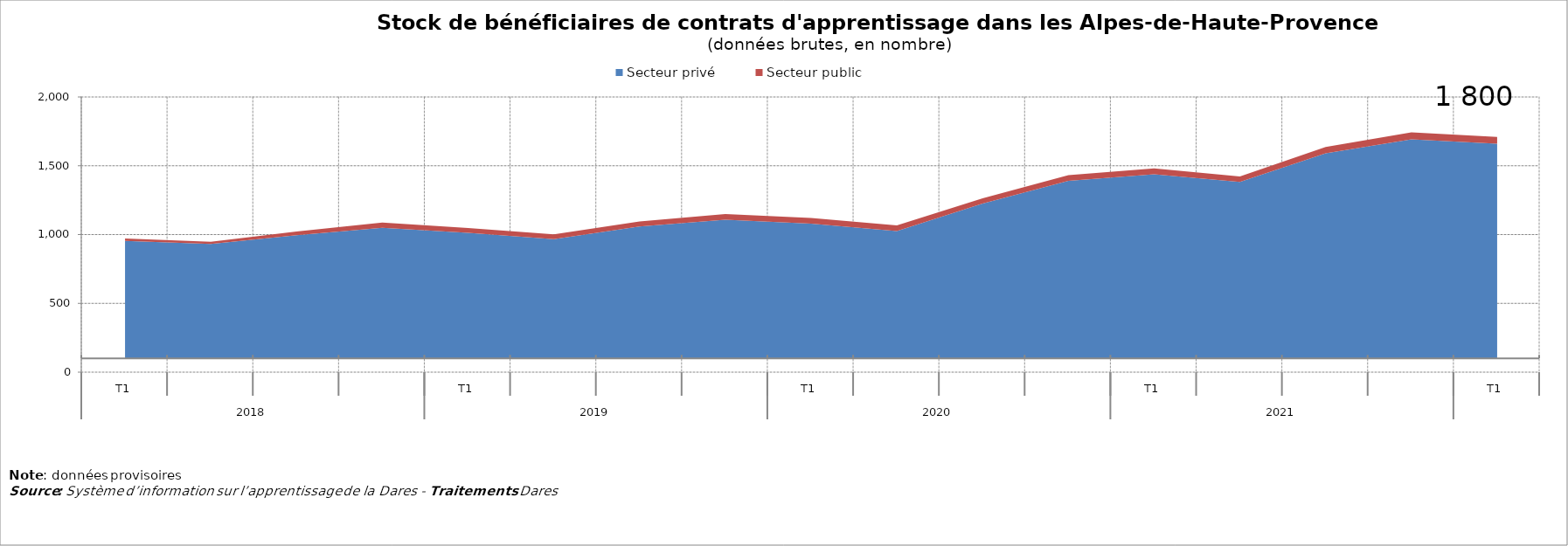
| Category | Secteur privé | Secteur public |
|---|---|---|
| 0 | 954 | 18 |
| 1 | 931 | 17 |
| 2 | 995 | 27 |
| 3 | 1050 | 37 |
| 4 | 1012 | 36 |
| 5 | 966 | 36 |
| 6 | 1058 | 38 |
| 7 | 1108 | 41 |
| 8 | 1080 | 40 |
| 9 | 1026 | 40 |
| 10 | 1225 | 38 |
| 11 | 1390 | 41 |
| 12 | 1438 | 43 |
| 13 | 1382 | 41 |
| 14 | 1590 | 46 |
| 15 | 1692 | 51 |
| 16 | 1660 | 49 |